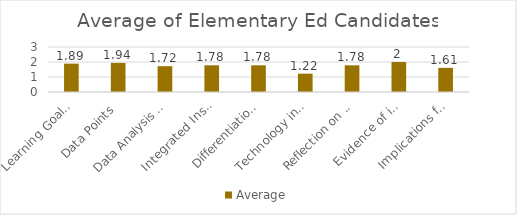
| Category | Average |
|---|---|
| Learning Goals Aligned with Pre-/Post-assessments ACEI 4.0 | 1.89 |
| Data Points | 1.94 |
| Data Analysis for Pedagogical Decisions ACEI 4.0 | 1.72 |
| Integrated Instruction ACEI 3.1 | 1.78 |
| Differentiation based on knowledge of individual learning ACEI 3.2 | 1.78 |
| Technology integration | 1.22 |
| Reflection on pedagogical decisions ACEI 1.0 | 1.78 |
| Evidence of impact on student learning ACEI 5.1 | 2 |
| Implications for teaching and professional development ACEI 5.1 | 1.61 |